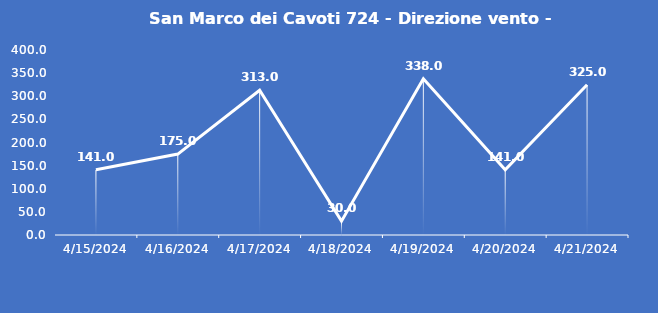
| Category | San Marco dei Cavoti 724 - Direzione vento - Grezzo (°N) |
|---|---|
| 4/15/24 | 141 |
| 4/16/24 | 175 |
| 4/17/24 | 313 |
| 4/18/24 | 30 |
| 4/19/24 | 338 |
| 4/20/24 | 141 |
| 4/21/24 | 325 |